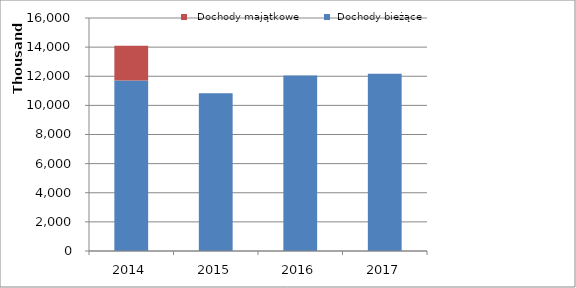
| Category |  Dochody bieżące |   Dochody majątkowe |
|---|---|---|
| 2014.0 | 11708269.67 | 2379904 |
| 2015.0 | 10825000 | 0 |
| 2016.0 | 12050000 | 0 |
| 2017.0 | 12170000 | 0 |